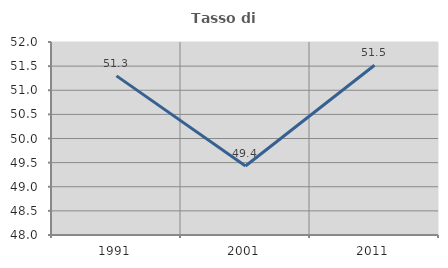
| Category | Tasso di occupazione   |
|---|---|
| 1991.0 | 51.298 |
| 2001.0 | 49.431 |
| 2011.0 | 51.518 |